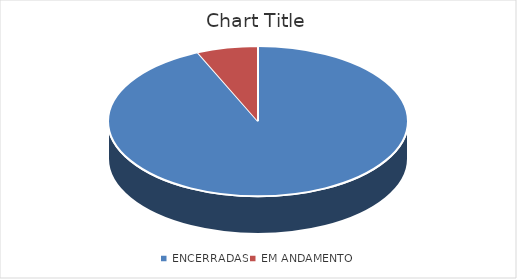
| Category | Series 0 |
|---|---|
| ENCERRADAS | 0.934 |
| EM ANDAMENTO | 0.066 |